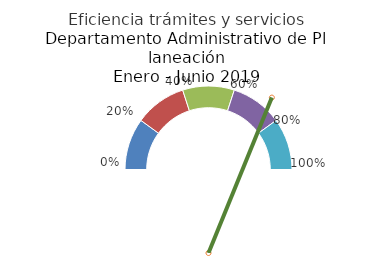
| Category | 2.432200764 |
|---|---|
| 0.0 | 0.2 |
| 0.2 | 0.2 |
| 0.4 | 0.2 |
| 0.6 | 0.2 |
| 0.8 | 0.2 |
| 1.0 | 1 |